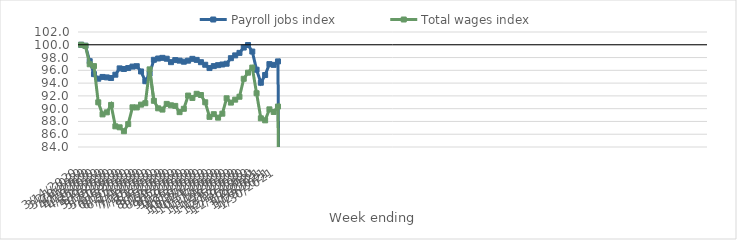
| Category | Payroll jobs index | Total wages index |
|---|---|---|
| 14/03/2020 | 100 | 100 |
| 21/03/2020 | 99.849 | 99.829 |
| 28/03/2020 | 97.432 | 96.95 |
| 04/04/2020 | 95.408 | 96.663 |
| 11/04/2020 | 94.692 | 90.992 |
| 18/04/2020 | 94.966 | 89.104 |
| 25/04/2020 | 94.895 | 89.421 |
| 02/05/2020 | 94.797 | 90.584 |
| 09/05/2020 | 95.317 | 87.233 |
| 16/05/2020 | 96.305 | 87.082 |
| 23/05/2020 | 96.21 | 86.468 |
| 30/05/2020 | 96.356 | 87.583 |
| 06/06/2020 | 96.586 | 90.211 |
| 13/06/2020 | 96.649 | 90.194 |
| 20/06/2020 | 95.822 | 90.632 |
| 27/06/2020 | 94.302 | 90.855 |
| 04/07/2020 | 95.488 | 96.151 |
| 11/07/2020 | 97.647 | 91.232 |
| 18/07/2020 | 97.85 | 90.054 |
| 25/07/2020 | 97.955 | 89.856 |
| 01/08/2020 | 97.816 | 90.746 |
| 08/08/2020 | 97.279 | 90.527 |
| 15/08/2020 | 97.606 | 90.432 |
| 22/08/2020 | 97.519 | 89.454 |
| 29/08/2020 | 97.349 | 89.98 |
| 05/09/2020 | 97.513 | 92.053 |
| 12/09/2020 | 97.798 | 91.678 |
| 19/09/2020 | 97.635 | 92.326 |
| 26/09/2020 | 97.274 | 92.137 |
| 03/10/2020 | 96.873 | 90.998 |
| 10/10/2020 | 96.357 | 88.719 |
| 17/10/2020 | 96.662 | 89.138 |
| 24/10/2020 | 96.808 | 88.595 |
| 31/10/2020 | 96.913 | 89.215 |
| 07/11/2020 | 97.034 | 91.623 |
| 14/11/2020 | 97.902 | 90.949 |
| 21/11/2020 | 98.339 | 91.412 |
| 28/11/2020 | 98.732 | 91.866 |
| 05/12/2020 | 99.566 | 94.678 |
| 12/12/2020 | 99.961 | 95.633 |
| 19/12/2020 | 98.938 | 96.43 |
| 26/12/2020 | 96.094 | 92.413 |
| 02/01/2021 | 94.057 | 88.49 |
| 09/01/2021 | 95.265 | 88.173 |
| 16/01/2021 | 96.974 | 89.893 |
| 23/01/2021 | 96.854 | 89.484 |
| 30/01/2021 | 97.396 | 90.334 |